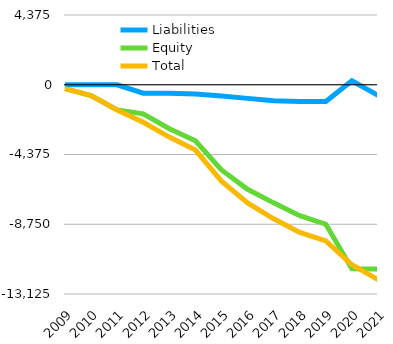
| Category | Liabilities  | Equity  | Total  |
|---|---|---|---|
| 2009 | 0 | -243 | -243 |
| 2010 | 0 | -682 | -682 |
| 2011 | 0 | -1578 | -1578 |
| 2012 | -529 | -1822 | -2351 |
| 2013 | -529 | -2755 | -3284 |
| 2014 | -585 | -3510 | -4095 |
| 2015 | -704 | -5340 | -6044 |
| 2016 | -855 | -6557 | -7412 |
| 2017 | -1001 | -7408 | -8409 |
| 2018 | -1048 | -8212 | -9260 |
| 2019 | -1051 | -8748 | -9799 |
| 2020 | 250 | -11541 | -11291 |
| 2021 | -662 | -11558.2 | -12220.2 |